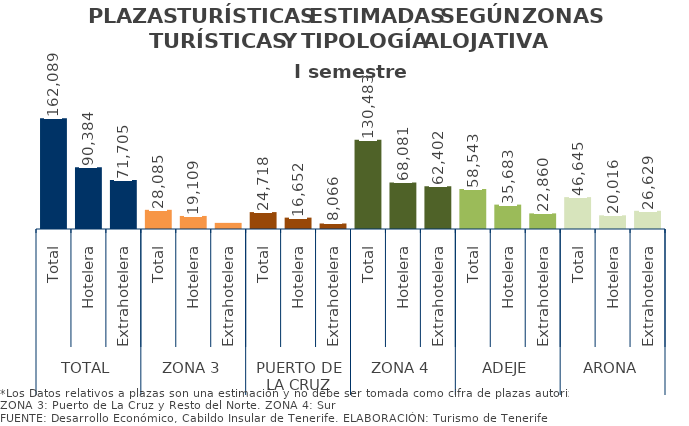
| Category | I semestre 2014 |
|---|---|
| 0 | 162089 |
| 1 | 90384 |
| 2 | 71705 |
| 3 | 28085 |
| 4 | 19109 |
| 5 | 8976 |
| 6 | 24718 |
| 7 | 16652 |
| 8 | 8066 |
| 9 | 130483 |
| 10 | 68081 |
| 11 | 62402 |
| 12 | 58543 |
| 13 | 35683 |
| 14 | 22860 |
| 15 | 46645 |
| 16 | 20016 |
| 17 | 26629 |